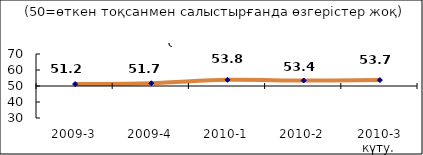
| Category | Диф.индекс ↓ |
|---|---|
| 2009-3 | 51.195 |
| 2009-4 | 51.725 |
| 2010-1 | 53.83 |
| 2010-2 | 53.44 |
| 2010-3 күту. | 53.7 |